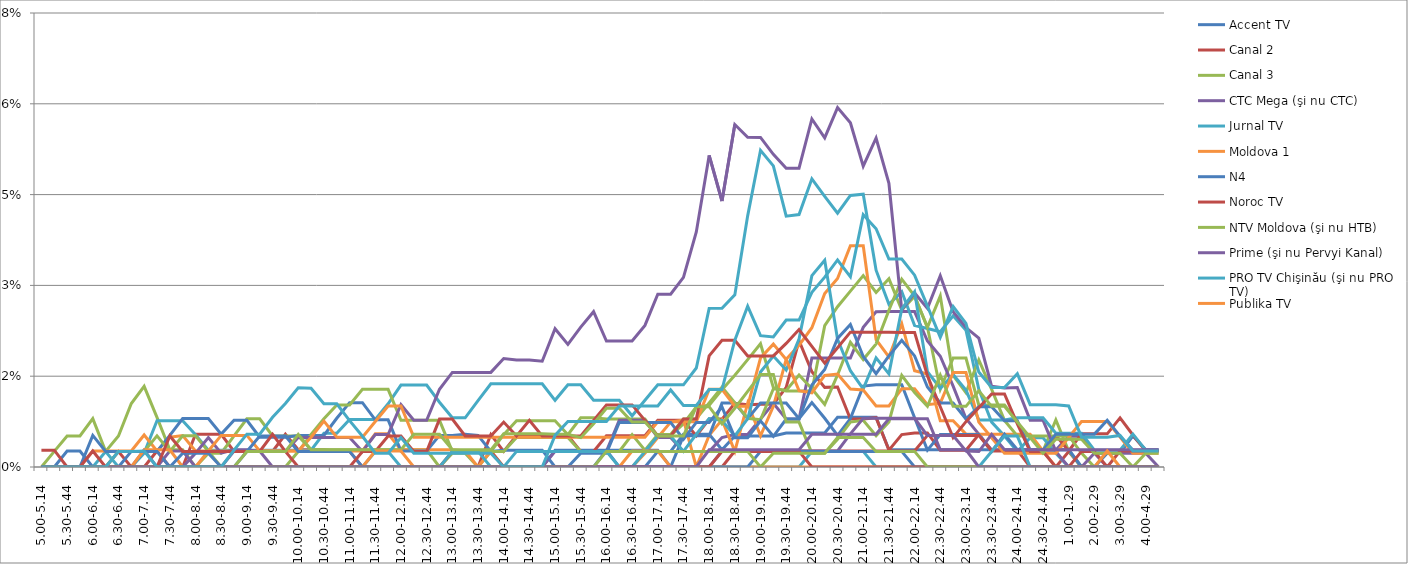
| Category | Accent TV | Canal 2 | Canal 3 | CTC Mega (şi nu CTC) | Jurnal TV | Moldova 1 | N4 | Noroc TV | NTV Moldova (şi nu HTB) | Prime (şi nu Pervyi Kanal) | PRO TV Chişinău (şi nu PRO TV) | Publika TV  | REN-TV Moldova (şi nu REN TV)  | RTR Moldova( şi nu PTP)  | THT Exclusiv (şi nu THT) | TV8 | TVC 21 | TVR MOLDOVA (şi nu TVR) | Canal Regional | Familia Domashniy | ITV | Moldova 2 | Alt canal |
|---|---|---|---|---|---|---|---|---|---|---|---|---|---|---|---|---|---|---|---|---|---|---|---|
| 5.00-5.14 | 0 | 0 | 0 | 0 | 0 | 0 | 0 | 0 | 0 | 0 | 0 | 0 | 0 | 0.003 | 0 | 0 | 0 | 0 | 0 | 0 | 0 | 0 | 0 |
| 5.15-5.29 | 0 | 0 | 0.003 | 0 | 0 | 0 | 0 | 0 | 0 | 0 | 0 | 0 | 0 | 0.003 | 0 | 0 | 0 | 0 | 0 | 0 | 0 | 0 | 0 |
| 5.30-5.44 | 0 | 0 | 0.005 | 0 | 0 | 0 | 0 | 0 | 0 | 0 | 0 | 0 | 0.003 | 0 | 0 | 0 | 0 | 0 | 0 | 0 | 0 | 0 | 0 |
| 5.45-5.59 | 0 | 0 | 0.005 | 0 | 0 | 0 | 0 | 0 | 0 | 0 | 0 | 0 | 0.003 | 0 | 0 | 0 | 0 | 0 | 0 | 0 | 0 | 0 | 0 |
| 6.00-6.14 | 0 | 0 | 0.008 | 0 | 0 | 0.003 | 0.005 | 0 | 0 | 0 | 0 | 0 | 0 | 0.003 | 0 | 0 | 0 | 0 | 0 | 0 | 0 | 0 | 0 |
| 6.15-6.29 | 0 | 0 | 0.003 | 0 | 0.003 | 0.003 | 0.003 | 0 | 0 | 0 | 0 | 0 | 0 | 0 | 0 | 0 | 0 | 0 | 0 | 0 | 0 | 0 | 0 |
| 6.30-6.44 | 0 | 0.003 | 0.005 | 0 | 0 | 0.003 | 0.003 | 0 | 0.003 | 0 | 0 | 0 | 0 | 0 | 0 | 0 | 0 | 0 | 0 | 0 | 0 | 0 | 0.003 |
| 6.45-6.59 | 0 | 0 | 0.01 | 0 | 0 | 0.003 | 0.003 | 0 | 0.003 | 0 | 0 | 0 | 0.003 | 0 | 0 | 0 | 0 | 0 | 0 | 0 | 0 | 0 | 0.003 |
| 7.00-7.14 | 0 | 0 | 0.013 | 0 | 0.002 | 0.005 | 0.003 | 0 | 0.003 | 0.003 | 0 | 0.003 | 0.003 | 0 | 0 | 0 | 0 | 0 | 0 | 0 | 0 | 0 | 0.003 |
| 7.15-7.29 | 0 | 0 | 0.008 | 0 | 0.008 | 0.003 | 0.003 | 0.003 | 0.005 | 0 | 0 | 0.003 | 0.003 | 0 | 0 | 0 | 0 | 0 | 0 | 0 | 0 | 0 | 0 |
| 7.30-7.44 | 0 | 0 | 0.003 | 0.003 | 0.008 | 0.005 | 0.005 | 0 | 0.003 | 0 | 0 | 0.003 | 0 | 0.005 | 0 | 0 | 0 | 0 | 0 | 0 | 0 | 0 | 0 |
| 7.45-7.59 | 0 | 0 | 0.003 | 0.003 | 0.008 | 0.005 | 0.008 | 0 | 0.005 | 0 | 0 | 0 | 0.002 | 0.003 | 0 | 0 | 0 | 0 | 0 | 0 | 0 | 0 | 0 |
| 8.00-8.14 | 0 | 0.005 | 0 | 0 | 0.005 | 0.003 | 0.008 | 0 | 0.005 | 0.002 | 0 | 0 | 0.002 | 0.003 | 0 | 0 | 0 | 0 | 0 | 0 | 0 | 0 | 0 |
| 8.15-8.29 | 0 | 0.005 | 0.002 | 0 | 0.003 | 0.003 | 0.008 | 0 | 0.003 | 0.005 | 0 | 0.003 | 0.002 | 0.003 | 0 | 0 | 0 | 0 | 0 | 0 | 0 | 0 | 0 |
| 8.30-8.44 | 0 | 0.005 | 0.002 | 0 | 0.003 | 0.003 | 0.005 | 0 | 0 | 0.002 | 0 | 0.005 | 0 | 0.003 | 0 | 0 | 0 | 0 | 0 | 0 | 0 | 0 | 0 |
| 8.45-8.59 | 0 | 0.003 | 0.005 | 0.003 | 0.003 | 0.003 | 0.008 | 0 | 0 | 0.003 | 0 | 0.005 | 0 | 0.003 | 0 | 0 | 0 | 0 | 0 | 0 | 0 | 0 | 0.003 |
| 9.00-9.14 | 0 | 0.003 | 0.008 | 0.003 | 0.003 | 0.003 | 0.008 | 0 | 0 | 0.003 | 0 | 0.005 | 0.003 | 0.003 | 0.003 | 0 | 0 | 0 | 0 | 0 | 0 | 0 | 0.005 |
| 9.15-9.29 | 0 | 0.003 | 0.008 | 0.003 | 0.003 | 0.003 | 0.005 | 0 | 0 | 0.003 | 0 | 0.003 | 0.005 | 0.003 | 0.003 | 0 | 0 | 0 | 0 | 0 | 0 | 0 | 0.005 |
| 9.30-9.44 | 0 | 0.003 | 0.005 | 0 | 0.003 | 0.003 | 0.005 | 0 | 0 | 0.003 | 0 | 0.003 | 0.005 | 0.005 | 0.003 | 0 | 0 | 0 | 0 | 0 | 0 | 0 | 0.008 |
| 9.45-9.59 | 0 | 0.005 | 0.005 | 0 | 0.003 | 0.003 | 0.005 | 0 | 0 | 0.003 | 0 | 0.003 | 0.005 | 0.003 | 0.003 | 0 | 0 | 0 | 0 | 0 | 0 | 0 | 0.011 |
| 10.00-10.14 | 0 | 0.003 | 0.005 | 0 | 0.003 | 0.003 | 0.005 | 0 | 0.003 | 0.005 | 0 | 0.003 | 0.003 | 0 | 0.005 | 0 | 0 | 0 | 0 | 0 | 0 | 0 | 0.013 |
| 10.15-10.29 | 0 | 0.003 | 0.003 | 0 | 0.003 | 0.003 | 0.005 | 0 | 0.005 | 0.005 | 0 | 0.005 | 0.003 | 0 | 0.003 | 0 | 0 | 0 | 0 | 0 | 0 | 0 | 0.013 |
| 10.30-10.44 | 0 | 0.003 | 0.003 | 0 | 0.006 | 0.003 | 0.005 | 0 | 0.008 | 0.005 | 0 | 0.008 | 0.003 | 0 | 0.003 | 0 | 0 | 0 | 0 | 0 | 0 | 0 | 0.01 |
| 10.45-10.59 | 0 | 0.003 | 0.003 | 0 | 0.006 | 0.003 | 0.008 | 0 | 0.01 | 0.005 | 0 | 0.005 | 0.003 | 0 | 0.003 | 0 | 0 | 0 | 0 | 0 | 0 | 0 | 0.01 |
| 11.00-11.14 | 0 | 0.003 | 0.003 | 0 | 0.008 | 0.003 | 0.011 | 0 | 0.01 | 0.005 | 0 | 0.005 | 0.003 | 0 | 0.003 | 0 | 0 | 0 | 0 | 0 | 0 | 0 | 0.008 |
| 11.15-11.29 | 0 | 0 | 0.003 | 0 | 0.008 | 0.003 | 0.011 | 0 | 0.013 | 0.003 | 0 | 0.005 | 0 | 0.003 | 0.003 | 0 | 0 | 0 | 0 | 0 | 0 | 0 | 0.005 |
| 11.30-11.44 | 0 | 0 | 0.003 | 0 | 0.008 | 0.005 | 0.008 | 0 | 0.013 | 0.005 | 0.003 | 0.008 | 0 | 0.003 | 0.003 | 0 | 0 | 0.003 | 0 | 0 | 0 | 0 | 0.002 |
| 11.45-11.59 | 0 | 0 | 0.003 | 0 | 0.01 | 0.005 | 0.008 | 0 | 0.013 | 0.005 | 0.003 | 0.01 | 0 | 0.005 | 0.003 | 0 | 0 | 0.003 | 0 | 0 | 0 | 0 | 0.002 |
| 12.00-12.14 | 0 | 0 | 0.003 | 0 | 0.014 | 0.003 | 0.003 | 0 | 0.008 | 0.01 | 0 | 0.01 | 0 | 0.005 | 0.003 | 0 | 0 | 0.003 | 0 | 0 | 0 | 0 | 0.005 |
| 12.15-12.29 | 0 | 0 | 0.003 | 0 | 0.014 | 0.003 | 0.003 | 0 | 0.008 | 0.008 | 0 | 0.005 | 0 | 0.003 | 0.005 | 0 | 0 | 0 | 0 | 0 | 0 | 0 | 0.002 |
| 12.30-12.44 | 0 | 0 | 0.003 | 0 | 0.014 | 0.003 | 0.003 | 0 | 0.008 | 0.008 | 0 | 0.005 | 0 | 0.003 | 0.005 | 0 | 0 | 0 | 0 | 0 | 0 | 0 | 0.002 |
| 12.45-12.59 | 0 | 0 | 0 | 0 | 0.011 | 0.003 | 0.005 | 0 | 0.008 | 0.013 | 0 | 0.005 | 0 | 0.008 | 0.005 | 0 | 0 | 0 | 0 | 0 | 0 | 0 | 0.002 |
| 13.00-13.14 | 0 | 0 | 0.002 | 0 | 0.008 | 0.003 | 0.005 | 0.003 | 0.003 | 0.016 | 0.003 | 0.005 | 0 | 0.008 | 0.003 | 0 | 0 | 0 | 0 | 0 | 0 | 0 | 0.002 |
| 13.15-13.29 | 0 | 0 | 0.002 | 0 | 0.008 | 0.003 | 0.005 | 0.003 | 0.003 | 0.016 | 0.003 | 0.005 | 0 | 0.005 | 0.003 | 0 | 0 | 0 | 0 | 0 | 0 | 0 | 0.002 |
| 13.30-13.44 | 0 | 0 | 0 | 0 | 0.011 | 0 | 0.005 | 0.003 | 0.003 | 0.016 | 0.003 | 0.005 | 0 | 0.005 | 0.003 | 0 | 0 | 0 | 0 | 0 | 0 | 0 | 0.002 |
| 13.45-13.59 | 0 | 0.005 | 0.003 | 0 | 0.014 | 0.003 | 0.003 | 0.003 | 0.003 | 0.016 | 0 | 0.005 | 0 | 0.005 | 0.003 | 0 | 0 | 0 | 0 | 0 | 0 | 0 | 0.002 |
| 14.00-14.14 | 0 | 0.003 | 0.005 | 0 | 0.014 | 0 | 0.003 | 0 | 0.003 | 0.018 | 0 | 0.005 | 0 | 0.007 | 0.005 | 0 | 0 | 0 | 0 | 0 | 0 | 0 | 0 |
| 14.15-14.29 | 0 | 0.005 | 0.008 | 0 | 0.014 | 0 | 0.003 | 0 | 0.005 | 0.018 | 0 | 0.005 | 0 | 0.005 | 0.005 | 0 | 0.003 | 0 | 0 | 0 | 0 | 0 | 0 |
| 14.30-14.44 | 0 | 0.005 | 0.008 | 0 | 0.014 | 0 | 0.003 | 0 | 0.005 | 0.018 | 0 | 0.005 | 0 | 0.008 | 0.005 | 0 | 0.003 | 0 | 0 | 0 | 0 | 0 | 0 |
| 14.45-14.59 | 0 | 0.005 | 0.008 | 0 | 0.014 | 0 | 0.003 | 0 | 0.005 | 0.017 | 0 | 0.005 | 0 | 0.005 | 0.005 | 0 | 0.003 | 0 | 0 | 0 | 0 | 0 | 0 |
| 15.00-15.14 | 0.003 | 0.005 | 0.008 | 0.003 | 0.011 | 0 | 0 | 0 | 0.005 | 0.023 | 0 | 0.005 | 0 | 0.005 | 0.005 | 0 | 0.003 | 0 | 0 | 0 | 0 | 0 | 0.005 |
| 15.15-15.29 | 0.003 | 0.005 | 0.005 | 0.003 | 0.014 | 0 | 0 | 0 | 0.005 | 0.02 | 0 | 0.005 | 0 | 0.005 | 0.005 | 0 | 0.003 | 0 | 0 | 0 | 0 | 0 | 0.008 |
| 15.30-15.44 | 0.003 | 0.003 | 0.008 | 0.003 | 0.014 | 0 | 0 | 0 | 0.003 | 0.023 | 0 | 0.005 | 0.002 | 0.005 | 0.005 | 0 | 0.003 | 0 | 0 | 0 | 0 | 0 | 0.008 |
| 15.45-15.59 | 0.003 | 0.003 | 0.008 | 0.003 | 0.011 | 0 | 0 | 0 | 0.003 | 0.026 | 0 | 0.005 | 0.002 | 0.008 | 0.007 | 0 | 0.003 | 0 | 0 | 0 | 0 | 0 | 0.008 |
| 16.00-16.14 | 0.003 | 0.005 | 0.008 | 0.003 | 0.011 | 0 | 0.003 | 0 | 0.003 | 0.021 | 0 | 0.005 | 0.002 | 0.01 | 0.01 | 0 | 0.003 | 0 | 0 | 0 | 0.003 | 0 | 0.008 |
| 16.15-16.29 | 0 | 0.005 | 0.008 | 0.008 | 0.011 | 0 | 0.003 | 0 | 0.003 | 0.021 | 0 | 0.005 | 0.007 | 0.01 | 0.01 | 0 | 0 | 0 | 0 | 0 | 0.003 | 0 | 0.01 |
| 16.30-16.44 | 0 | 0.005 | 0.008 | 0.008 | 0.008 | 0 | 0.003 | 0 | 0.005 | 0.021 | 0 | 0.005 | 0.007 | 0.01 | 0.007 | 0 | 0 | 0.003 | 0 | 0 | 0.003 | 0 | 0.01 |
| 16.45-16.59 | 0 | 0.005 | 0.008 | 0.008 | 0.011 | 0.002 | 0.003 | 0 | 0.003 | 0.023 | 0.003 | 0.005 | 0.007 | 0.008 | 0.007 | 0 | 0 | 0.003 | 0 | 0 | 0.003 | 0 | 0.01 |
| 17.00-17.14 | 0.003 | 0.008 | 0.005 | 0.005 | 0.014 | 0.005 | 0.003 | 0 | 0.005 | 0.029 | 0.005 | 0.007 | 0.007 | 0.005 | 0.005 | 0 | 0 | 0.003 | 0 | 0 | 0.003 | 0 | 0.01 |
| 17.15-17.29 | 0.003 | 0.008 | 0.005 | 0.005 | 0.014 | 0.007 | 0 | 0 | 0.005 | 0.029 | 0.005 | 0.007 | 0.007 | 0.005 | 0.005 | 0 | 0 | 0 | 0 | 0 | 0.003 | 0 | 0.013 |
| 17.30-17.44 | 0.005 | 0.008 | 0.007 | 0.003 | 0.014 | 0.008 | 0.005 | 0 | 0.008 | 0.031 | 0.003 | 0.007 | 0.005 | 0.008 | 0.005 | 0 | 0 | 0 | 0 | 0 | 0.003 | 0 | 0.01 |
| 17.45-17.59 | 0.005 | 0.005 | 0.01 | 0.003 | 0.016 | 0 | 0.005 | 0 | 0.008 | 0.039 | 0.005 | 0.007 | 0.007 | 0.008 | 0.01 | 0 | 0 | 0 | 0 | 0 | 0.003 | 0 | 0.01 |
| 18.00-18.14 | 0.005 | 0.008 | 0.01 | 0.003 | 0.026 | 0.005 | 0.005 | 0 | 0.011 | 0.051 | 0.008 | 0.013 | 0.007 | 0.018 | 0.01 | 0 | 0 | 0 | 0 | 0 | 0.003 | 0.003 | 0.013 |
| 18.15-18.29 | 0.003 | 0.008 | 0.013 | 0.005 | 0.026 | 0.008 | 0.011 | 0 | 0.013 | 0.044 | 0.008 | 0.013 | 0.01 | 0.021 | 0.007 | 0.003 | 0 | 0 | 0 | 0.003 | 0.003 | 0.003 | 0.013 |
| 18.30-18.44 | 0.005 | 0.011 | 0.015 | 0.005 | 0.028 | 0.003 | 0.011 | 0.003 | 0.011 | 0.057 | 0.005 | 0.01 | 0.005 | 0.021 | 0.01 | 0.003 | 0 | 0 | 0 | 0.003 | 0.003 | 0.003 | 0.021 |
| 18.45-18.59 | 0.005 | 0.01 | 0.018 | 0.005 | 0.041 | 0.011 | 0.008 | 0.003 | 0.008 | 0.054 | 0.008 | 0.01 | 0.005 | 0.018 | 0.012 | 0.003 | 0 | 0 | 0 | 0.003 | 0.003 | 0.003 | 0.027 |
| 19.00-19.14 | 0.005 | 0.01 | 0.02 | 0.008 | 0.052 | 0.005 | 0.011 | 0.003 | 0.008 | 0.054 | 0.016 | 0.018 | 0.008 | 0.018 | 0.015 | 0.003 | 0 | 0 | 0.003 | 0.003 | 0 | 0.003 | 0.022 |
| 19.15-19.29 | 0.005 | 0.01 | 0.013 | 0.011 | 0.05 | 0.01 | 0.011 | 0.003 | 0.013 | 0.052 | 0.018 | 0.02 | 0.005 | 0.018 | 0.015 | 0.003 | 0 | 0 | 0.003 | 0.003 | 0.002 | 0.003 | 0.021 |
| 19.30-19.44 | 0.006 | 0.013 | 0.013 | 0.008 | 0.041 | 0.018 | 0.011 | 0.003 | 0.013 | 0.049 | 0.016 | 0.018 | 0.008 | 0.02 | 0.007 | 0.003 | 0 | 0 | 0.003 | 0.003 | 0.002 | 0.003 | 0.024 |
| 19.45-19.59 | 0.006 | 0.021 | 0.013 | 0.008 | 0.042 | 0.02 | 0.008 | 0.003 | 0.015 | 0.049 | 0.021 | 0.013 | 0.008 | 0.023 | 0.007 | 0.003 | 0 | 0 | 0.003 | 0.003 | 0.002 | 0.003 | 0.024 |
| 20.00-20.14 | 0.006 | 0.016 | 0.013 | 0.018 | 0.048 | 0.023 | 0.011 | 0.003 | 0.013 | 0.057 | 0.032 | 0.012 | 0.014 | 0.02 | 0.002 | 0.003 | 0.003 | 0 | 0.003 | 0 | 0.002 | 0.005 | 0.029 |
| 20.15-20.29 | 0.006 | 0.013 | 0.023 | 0.018 | 0.045 | 0.029 | 0.008 | 0.003 | 0.01 | 0.054 | 0.034 | 0.015 | 0.016 | 0.017 | 0.002 | 0.003 | 0.003 | 0 | 0.003 | 0 | 0.002 | 0.005 | 0.031 |
| 20.30-20.44 | 0.008 | 0.013 | 0.026 | 0.018 | 0.042 | 0.031 | 0.005 | 0.003 | 0.015 | 0.059 | 0.021 | 0.015 | 0.021 | 0.02 | 0.005 | 0.003 | 0.003 | 0 | 0.003 | 0 | 0.005 | 0.005 | 0.034 |
| 20.45-20.59 | 0.008 | 0.008 | 0.029 | 0.018 | 0.045 | 0.037 | 0.008 | 0.003 | 0.021 | 0.057 | 0.016 | 0.013 | 0.024 | 0.022 | 0.007 | 0.005 | 0.003 | 0 | 0.003 | 0 | 0.005 | 0.005 | 0.031 |
| 21.00-21.14 | 0.008 | 0.008 | 0.032 | 0.023 | 0.045 | 0.037 | 0.013 | 0.003 | 0.018 | 0.05 | 0.013 | 0.013 | 0.018 | 0.022 | 0.008 | 0.008 | 0.003 | 0 | 0.003 | 0 | 0.005 | 0.005 | 0.042 |
| 21.15-21.29 | 0.008 | 0.008 | 0.029 | 0.026 | 0.033 | 0.021 | 0.014 | 0.003 | 0.02 | 0.054 | 0.018 | 0.01 | 0.015 | 0.022 | 0.005 | 0.008 | 0 | 0 | 0.003 | 0 | 0.003 | 0.005 | 0.039 |
| 21.30-21.44 | 0.003 | 0.003 | 0.031 | 0.026 | 0.027 | 0.018 | 0.014 | 0.003 | 0.026 | 0.047 | 0.015 | 0.01 | 0.018 | 0.022 | 0.007 | 0.008 | 0 | 0 | 0.003 | 0 | 0.003 | 0.008 | 0.034 |
| 21.45-21.59 | 0.003 | 0.005 | 0.026 | 0.026 | 0.029 | 0.024 | 0.014 | 0.003 | 0.031 | 0.026 | 0.026 | 0.013 | 0.021 | 0.022 | 0.015 | 0.008 | 0 | 0 | 0.003 | 0 | 0.003 | 0.008 | 0.034 |
| 22.00-22.14 | 0.003 | 0.006 | 0.028 | 0.026 | 0.023 | 0.016 | 0.008 | 0.003 | 0.028 | 0.029 | 0.029 | 0.013 | 0.018 | 0.022 | 0.012 | 0.008 | 0 | 0 | 0 | 0 | 0.003 | 0.008 | 0.032 |
| 22.15-22.29 | 0.003 | 0.006 | 0.023 | 0.021 | 0.023 | 0.015 | 0.003 | 0.005 | 0.023 | 0.026 | 0.016 | 0.01 | 0.013 | 0.015 | 0.01 | 0.005 | 0 | 0 | 0 | 0 | 0 | 0.008 | 0.027 |
| 22.30-22.44 | 0.003 | 0.003 | 0.013 | 0.018 | 0.022 | 0.008 | 0.005 | 0.005 | 0.028 | 0.032 | 0.013 | 0.011 | 0.011 | 0.01 | 0.015 | 0.005 | 0 | 0 | 0 | 0 | 0 | 0.003 | 0.021 |
| 22.45-22.59 | 0.003 | 0.003 | 0.018 | 0.013 | 0.025 | 0.008 | 0.005 | 0.005 | 0.015 | 0.026 | 0.015 | 0.016 | 0.011 | 0.005 | 0.01 | 0.005 | 0 | 0 | 0 | 0 | 0 | 0.003 | 0.027 |
| 23.00-23.14 | 0.003 | 0.003 | 0.018 | 0.008 | 0.023 | 0.005 | 0.005 | 0.005 | 0.012 | 0.023 | 0.013 | 0.016 | 0.008 | 0.007 | 0.01 | 0.003 | 0 | 0 | 0 | 0 | 0 | 0.003 | 0.024 |
| 23.15-23.29 | 0.003 | 0.005 | 0.01 | 0.005 | 0.013 | 0.005 | 0.005 | 0.005 | 0.018 | 0.021 | 0.008 | 0.007 | 0.01 | 0.01 | 0.013 | 0.003 | 0 | 0 | 0 | 0 | 0 | 0 | 0.016 |
| 23.30-23.44 | 0.003 | 0.003 | 0.01 | 0.003 | 0.007 | 0.005 | 0.003 | 0.003 | 0.013 | 0.013 | 0.008 | 0.005 | 0.01 | 0.012 | 0.01 | 0.005 | 0.003 | 0 | 0 | 0 | 0 | 0 | 0.013 |
| 23.45-23.59 | 0.003 | 0.003 | 0.01 | 0.003 | 0.005 | 0.005 | 0.005 | 0.003 | 0.008 | 0.013 | 0.008 | 0.002 | 0.008 | 0.012 | 0.01 | 0.003 | 0.005 | 0 | 0 | 0 | 0 | 0 | 0.013 |
| 24.00-24.14 | 0.003 | 0.003 | 0.008 | 0.003 | 0.003 | 0.005 | 0.003 | 0.003 | 0.005 | 0.013 | 0.008 | 0.002 | 0.008 | 0.007 | 0.007 | 0.003 | 0.005 | 0 | 0 | 0 | 0 | 0 | 0.015 |
| 24.15-24.29 | 0.003 | 0 | 0.003 | 0.003 | 0.005 | 0.005 | 0.003 | 0.003 | 0.005 | 0.008 | 0.008 | 0.002 | 0.003 | 0.003 | 0.005 | 0.003 | 0 | 0 | 0 | 0 | 0 | 0 | 0.01 |
| 24.30-24.44 | 0.003 | 0 | 0.003 | 0.003 | 0.005 | 0.003 | 0.003 | 0.003 | 0.005 | 0.008 | 0.008 | 0.002 | 0.003 | 0.003 | 0.002 | 0.003 | 0 | 0 | 0 | 0 | 0 | 0 | 0.01 |
| 24.45-24.59 | 0.003 | 0 | 0.008 | 0.003 | 0.002 | 0 | 0.003 | 0.005 | 0.005 | 0.003 | 0.006 | 0.002 | 0.005 | 0 | 0.005 | 0.003 | 0 | 0 | 0 | 0 | 0 | 0 | 0.01 |
| 1.00-1.29 | 0.003 | 0.003 | 0.003 | 0.005 | 0 | 0 | 0.003 | 0.003 | 0.005 | 0 | 0.006 | 0.005 | 0.005 | 0 | 0.005 | 0.003 | 0 | 0 | 0 | 0 | 0 | 0 | 0.01 |
| 1.30-1. 59 | 0 | 0 | 0 | 0.005 | 0 | 0 | 0 | 0.005 | 0.002 | 0 | 0.006 | 0.008 | 0.005 | 0.003 | 0.005 | 0.003 | 0 | 0 | 0 | 0 | 0 | 0 | 0.005 |
| 2.00-2.29 | 0 | 0 | 0 | 0.002 | 0 | 0 | 0 | 0.005 | 0 | 0.002 | 0.003 | 0.008 | 0.005 | 0.003 | 0.002 | 0.003 | 0 | 0 | 0 | 0 | 0 | 0 | 0.005 |
| 2.30-2.59 | 0 | 0 | 0 | 0 | 0 | 0 | 0.002 | 0.005 | 0 | 0.002 | 0.003 | 0.008 | 0.008 | 0 | 0.002 | 0.003 | 0 | 0.003 | 0 | 0 | 0 | 0 | 0.005 |
| 3.00-3.29 | 0 | 0 | 0 | 0 | 0 | 0 | 0.002 | 0.008 | 0 | 0.002 | 0.003 | 0.005 | 0.005 | 0.003 | 0.002 | 0.003 | 0 | 0 | 0 | 0 | 0 | 0 | 0.005 |
| 3.30-3.59 | 0 | 0 | 0 | 0 | 0 | 0 | 0.005 | 0.005 | 0 | 0.002 | 0.005 | 0.002 | 0.003 | 0.003 | 0 | 0.003 | 0 | 0 | 0 | 0 | 0 | 0 | 0.003 |
| 4.00-4.29 | 0 | 0 | 0 | 0 | 0 | 0 | 0.003 | 0.003 | 0 | 0.002 | 0.003 | 0.002 | 0.003 | 0.003 | 0.002 | 0.003 | 0 | 0 | 0 | 0 | 0 | 0 | 0.003 |
| 4.30-4.59 | 0 | 0 | 0 | 0 | 0 | 0 | 0.003 | 0.003 | 0 | 0 | 0.003 | 0.002 | 0.003 | 0.003 | 0.002 | 0.003 | 0 | 0 | 0 | 0 | 0 | 0 | 0.003 |